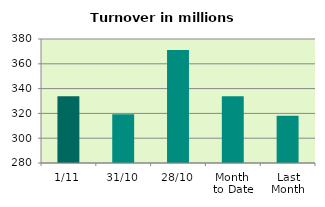
| Category | Series 0 |
|---|---|
| 1/11 | 333.873 |
| 31/10 | 319.349 |
| 28/10 | 371.215 |
| Month 
to Date | 333.873 |
| Last
Month | 318.176 |